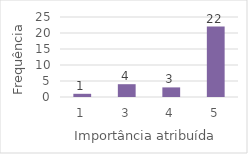
| Category | Series 0 |
|---|---|
| 1.0 | 1 |
| 3.0 | 4 |
| 4.0 | 3 |
| 5.0 | 22 |